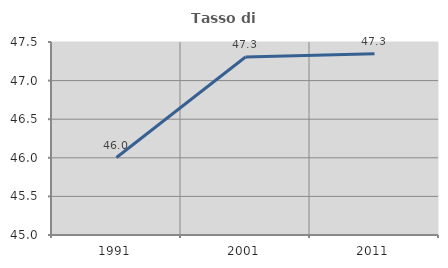
| Category | Tasso di occupazione   |
|---|---|
| 1991.0 | 46.004 |
| 2001.0 | 47.305 |
| 2011.0 | 47.347 |